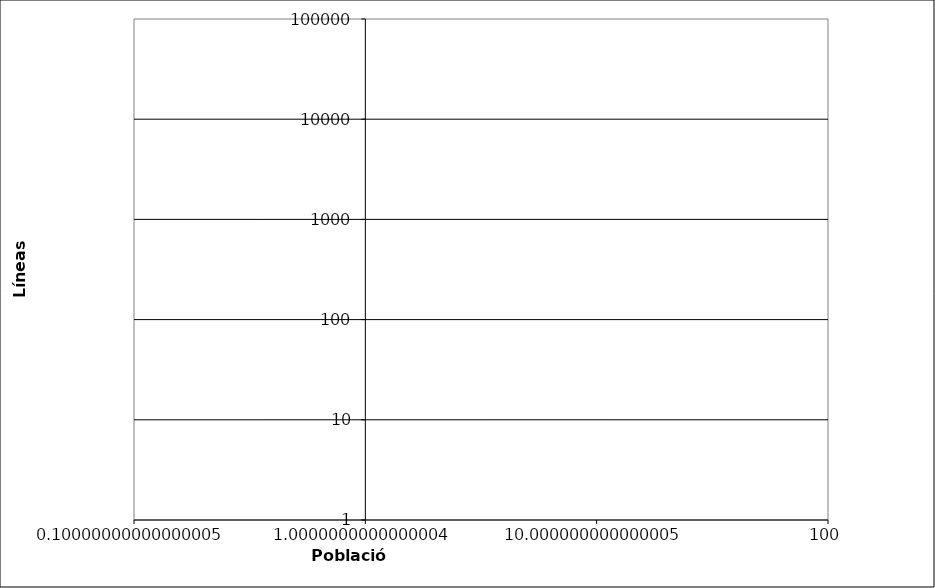
| Category | Series 0 |
|---|---|
| 76.84 | 41294.1 |
| 25.29 | 32377 |
| 34.370000000000005 | 30631.1 |
| 31.61000000000001 | 25807 |
| 29.49 | 15385.7 |
| 20.45 | 9686.7 |
| 4.5 | 9117 |
| 10.44 | 9115.7 |
| 39.879999999999995 | 8563.3 |
| 6.119999999999997 | 5357.2 |
| 23.07 | 3946.1 |
| 2.92 | 3047 |
| 6.28 | 2852.3 |
| 2.65 | 2768.1 |
| 4.14 | 1957.5 |
| 0.8600000000000003 | 1501.7 |
| 4.1499999999999995 | 1373.8 |
| 3.2 | 1340.3 |
| 0.7700000000000004 | 1101.6 |
| 8.960000000000003 | 700 |
| 0.8600000000000003 | 55.9 |
| 0.8500000000000003 | 54.8 |